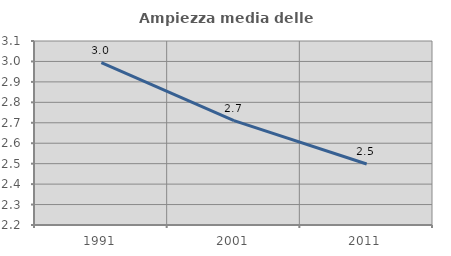
| Category | Ampiezza media delle famiglie |
|---|---|
| 1991.0 | 2.994 |
| 2001.0 | 2.71 |
| 2011.0 | 2.498 |